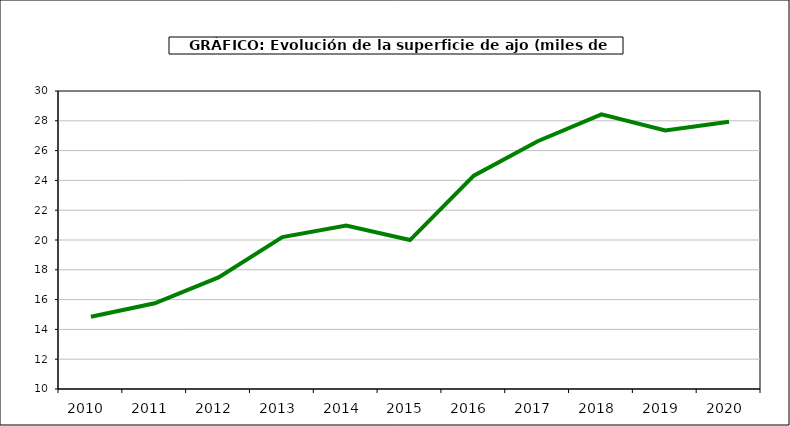
| Category | superficie |
|---|---|
| 2010.0 | 14.85 |
| 2011.0 | 15.75 |
| 2012.0 | 17.494 |
| 2013.0 | 20.197 |
| 2014.0 | 20.965 |
| 2015.0 | 19.996 |
| 2016.0 | 24.317 |
| 2017.0 | 26.63 |
| 2018.0 | 28.428 |
| 2019.0 | 27.348 |
| 2020.0 | 27.937 |